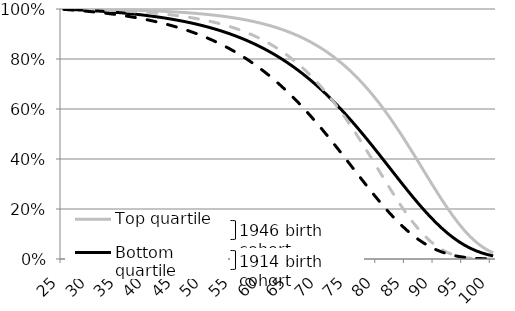
| Category | Top quartile | Bottom quartile |
|---|---|---|
| 25.0 | 1 | 0.998 |
| 26.0 | 0.999 | 0.997 |
| 27.0 | 0.999 | 0.995 |
| 28.0 | 0.998 | 0.993 |
| 29.0 | 0.997 | 0.991 |
| 30.0 | 0.997 | 0.989 |
| 31.0 | 0.996 | 0.986 |
| 32.0 | 0.995 | 0.984 |
| 33.0 | 0.994 | 0.981 |
| 34.0 | 0.993 | 0.978 |
| 35.0 | 0.992 | 0.975 |
| 36.0 | 0.991 | 0.971 |
| 37.0 | 0.99 | 0.968 |
| 38.0 | 0.988 | 0.964 |
| 39.0 | 0.987 | 0.959 |
| 40.0 | 0.985 | 0.955 |
| 41.0 | 0.983 | 0.95 |
| 42.0 | 0.981 | 0.944 |
| 43.0 | 0.978 | 0.939 |
| 44.0 | 0.976 | 0.932 |
| 45.0 | 0.973 | 0.926 |
| 46.0 | 0.97 | 0.919 |
| 47.0 | 0.966 | 0.911 |
| 48.0 | 0.962 | 0.903 |
| 49.0 | 0.958 | 0.894 |
| 50.0 | 0.953 | 0.885 |
| 51.0 | 0.948 | 0.875 |
| 52.0 | 0.943 | 0.864 |
| 53.0 | 0.937 | 0.853 |
| 54.0 | 0.93 | 0.84 |
| 55.0 | 0.922 | 0.827 |
| 56.0 | 0.914 | 0.814 |
| 57.0 | 0.905 | 0.799 |
| 58.0 | 0.896 | 0.784 |
| 59.0 | 0.885 | 0.767 |
| 60.0 | 0.873 | 0.75 |
| 61.0 | 0.861 | 0.731 |
| 62.0 | 0.847 | 0.712 |
| 63.0 | 0.832 | 0.692 |
| 64.0 | 0.816 | 0.67 |
| 65.0 | 0.798 | 0.648 |
| 66.0 | 0.779 | 0.625 |
| 67.0 | 0.759 | 0.6 |
| 68.0 | 0.736 | 0.575 |
| 69.0 | 0.713 | 0.549 |
| 70.0 | 0.688 | 0.522 |
| 71.0 | 0.661 | 0.494 |
| 72.0 | 0.632 | 0.466 |
| 73.0 | 0.602 | 0.437 |
| 74.0 | 0.57 | 0.408 |
| 75.0 | 0.537 | 0.378 |
| 76.0 | 0.503 | 0.349 |
| 77.0 | 0.467 | 0.32 |
| 78.0 | 0.43 | 0.29 |
| 79.0 | 0.393 | 0.262 |
| 80.0 | 0.356 | 0.234 |
| 81.0 | 0.318 | 0.207 |
| 82.0 | 0.281 | 0.182 |
| 83.0 | 0.245 | 0.157 |
| 84.0 | 0.21 | 0.134 |
| 85.0 | 0.177 | 0.113 |
| 86.0 | 0.146 | 0.094 |
| 87.0 | 0.118 | 0.077 |
| 88.0 | 0.093 | 0.062 |
| 89.0 | 0.072 | 0.049 |
| 90.0 | 0.053 | 0.038 |
| 91.0 | 0.038 | 0.028 |
| 92.0 | 0.026 | 0.021 |
| 93.0 | 0.017 | 0.015 |
| 94.0 | 0.01 | 0.01 |
| 95.0 | 0.006 | 0.007 |
| 96.0 | 0.003 | 0.004 |
| 97.0 | 0.002 | 0.003 |
| 98.0 | 0.001 | 0.001 |
| 99.0 | 0 | 0.001 |
| 100.0 | 0 | 0 |